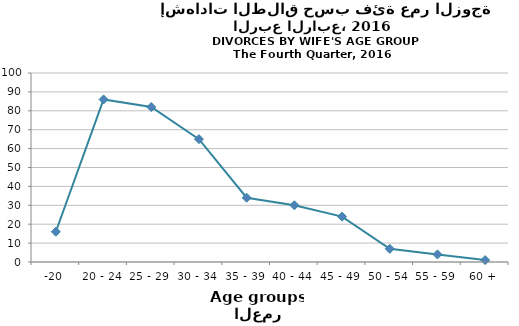
| Category | Series 0 |
|---|---|
| -20 | 16 |
| 20 - 24 | 86 |
| 25 - 29 | 82 |
| 30 - 34 | 65 |
| 35 - 39 | 34 |
| 40 - 44 | 30 |
| 45 - 49 | 24 |
| 50 - 54 | 7 |
| 55 - 59 | 4 |
| 60 + | 1 |